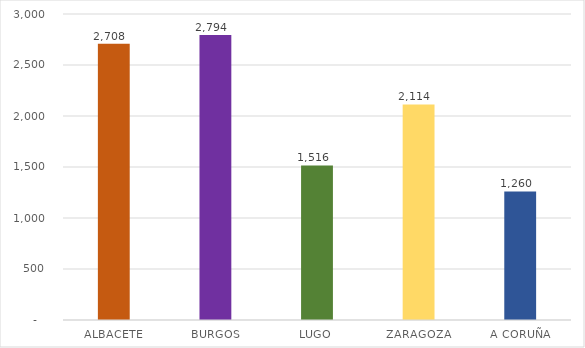
| Category | Series 0 |
|---|---|
| ALBACETE | 2707.96 |
| BURGOS | 2793.93 |
| LUGO | 1515.81 |
| ZARAGOZA | 2113.82 |
| A CORUÑA | 1260.298 |